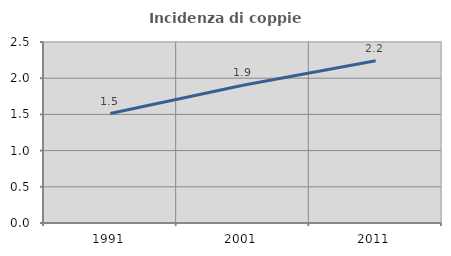
| Category | Incidenza di coppie miste |
|---|---|
| 1991.0 | 1.512 |
| 2001.0 | 1.903 |
| 2011.0 | 2.24 |